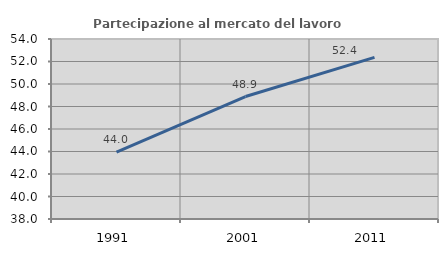
| Category | Partecipazione al mercato del lavoro  femminile |
|---|---|
| 1991.0 | 43.951 |
| 2001.0 | 48.887 |
| 2011.0 | 52.369 |